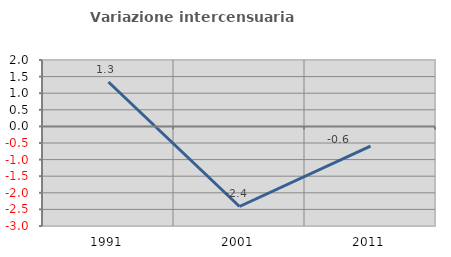
| Category | Variazione intercensuaria annua |
|---|---|
| 1991.0 | 1.337 |
| 2001.0 | -2.412 |
| 2011.0 | -0.593 |